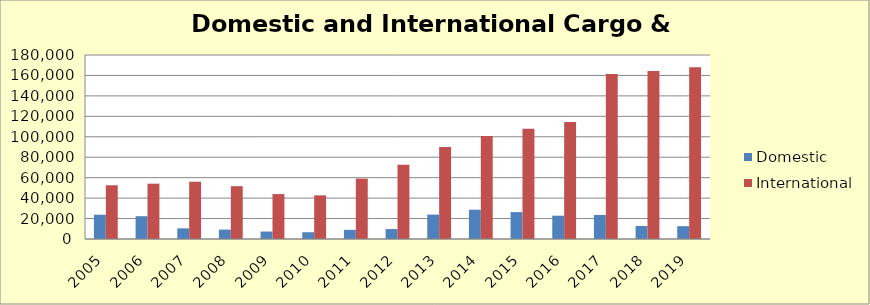
| Category | Domestic | International |
|---|---|---|
| 2005.0 | 23754.199 | 52561.784 |
| 2006.0 | 22297.867 | 54107.137 |
| 2007.0 | 10407.805 | 56029.11 |
| 2008.0 | 9180.525 | 51694.319 |
| 2009.0 | 7284.271 | 43920.458 |
| 2010.0 | 6636.941 | 42700.275 |
| 2011.0 | 8950.91 | 59067.418 |
| 2012.0 | 9718.883 | 72713.613 |
| 2013.0 | 23858.966 | 90082.71 |
| 2014.0 | 28657.141 | 100851.858 |
| 2015.0 | 26313.183 | 107924.896 |
| 2016.0 | 22802.694 | 114376.972 |
| 2017.0 | 23494.368 | 161479.187 |
| 2018.0 | 12724.598 | 164270.985 |
| 2019.0 | 12543.752 | 168034.176 |